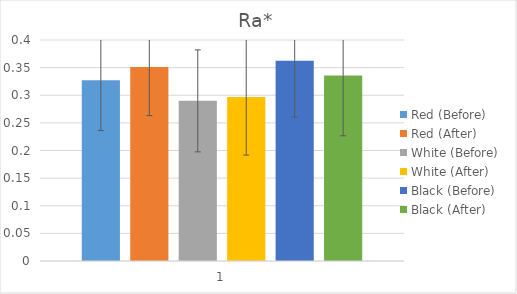
| Category | Red (Before) | Red (After) | White (Before) | White (After) | Black (Before) | Black (After) |
|---|---|---|---|---|---|---|
| 0 | 0.327 | 0.351 | 0.29 | 0.297 | 0.362 | 0.336 |